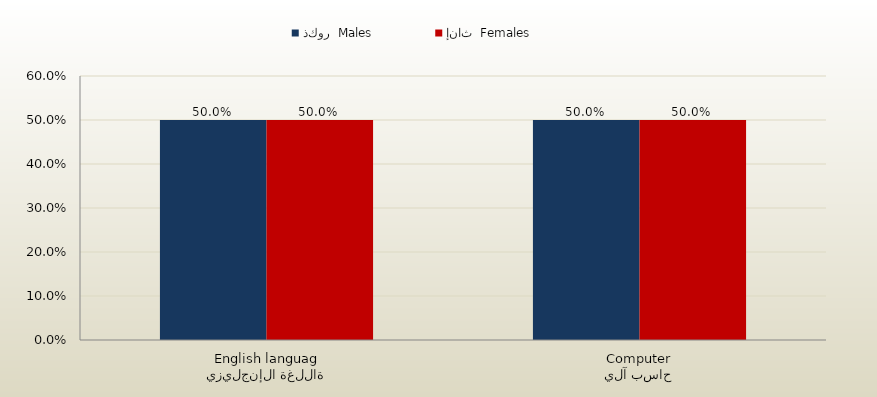
| Category | ذكور  Males | إناث  Females |
|---|---|---|
| اللغة الإنجليزية
English language | 0.5 | 0.5 |
| حاسب آلي
Computer | 0.5 | 0.5 |